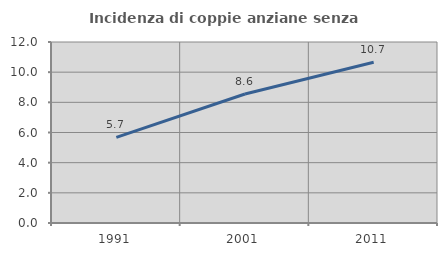
| Category | Incidenza di coppie anziane senza figli  |
|---|---|
| 1991.0 | 5.678 |
| 2001.0 | 8.551 |
| 2011.0 | 10.654 |